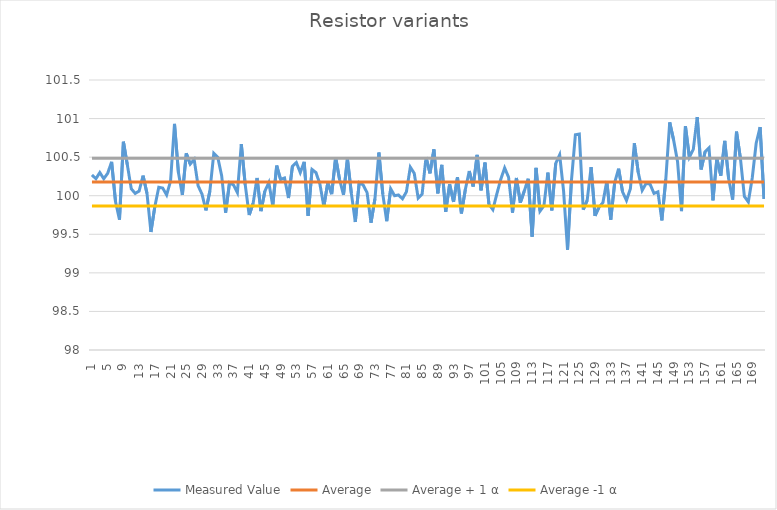
| Category | Measured Value | Average | Average + 1 α | Average -1 α |
|---|---|---|---|---|
| 1.0 | 100.27 | 100.177 | 100.486 | 99.867 |
| 2.0 | 100.22 | 100.177 | 100.486 | 99.867 |
| 3.0 | 100.3 | 100.177 | 100.486 | 99.867 |
| 4.0 | 100.22 | 100.177 | 100.486 | 99.867 |
| 5.0 | 100.29 | 100.177 | 100.486 | 99.867 |
| 6.0 | 100.44 | 100.177 | 100.486 | 99.867 |
| 7.0 | 99.92 | 100.177 | 100.486 | 99.867 |
| 8.0 | 99.69 | 100.177 | 100.486 | 99.867 |
| 9.0 | 100.7 | 100.177 | 100.486 | 99.867 |
| 10.0 | 100.4 | 100.177 | 100.486 | 99.867 |
| 11.0 | 100.09 | 100.177 | 100.486 | 99.867 |
| 12.0 | 100.03 | 100.177 | 100.486 | 99.867 |
| 13.0 | 100.06 | 100.177 | 100.486 | 99.867 |
| 14.0 | 100.26 | 100.177 | 100.486 | 99.867 |
| 15.0 | 100.03 | 100.177 | 100.486 | 99.867 |
| 16.0 | 99.53 | 100.177 | 100.486 | 99.867 |
| 17.0 | 99.86 | 100.177 | 100.486 | 99.867 |
| 18.0 | 100.11 | 100.177 | 100.486 | 99.867 |
| 19.0 | 100.1 | 100.177 | 100.486 | 99.867 |
| 20.0 | 100.01 | 100.177 | 100.486 | 99.867 |
| 21.0 | 100.19 | 100.177 | 100.486 | 99.867 |
| 22.0 | 100.93 | 100.177 | 100.486 | 99.867 |
| 23.0 | 100.3 | 100.177 | 100.486 | 99.867 |
| 24.0 | 100.01 | 100.177 | 100.486 | 99.867 |
| 25.0 | 100.55 | 100.177 | 100.486 | 99.867 |
| 26.0 | 100.41 | 100.177 | 100.486 | 99.867 |
| 27.0 | 100.47 | 100.177 | 100.486 | 99.867 |
| 28.0 | 100.13 | 100.177 | 100.486 | 99.867 |
| 29.0 | 100.02 | 100.177 | 100.486 | 99.867 |
| 30.0 | 99.81 | 100.177 | 100.486 | 99.867 |
| 31.0 | 100.06 | 100.177 | 100.486 | 99.867 |
| 32.0 | 100.55 | 100.177 | 100.486 | 99.867 |
| 33.0 | 100.5 | 100.177 | 100.486 | 99.867 |
| 34.0 | 100.26 | 100.177 | 100.486 | 99.867 |
| 35.0 | 99.78 | 100.177 | 100.486 | 99.867 |
| 36.0 | 100.17 | 100.177 | 100.486 | 99.867 |
| 37.0 | 100.14 | 100.177 | 100.486 | 99.867 |
| 38.0 | 100.04 | 100.177 | 100.486 | 99.867 |
| 39.0 | 100.67 | 100.177 | 100.486 | 99.867 |
| 40.0 | 100.14 | 100.177 | 100.486 | 99.867 |
| 41.0 | 99.75 | 100.177 | 100.486 | 99.867 |
| 42.0 | 99.9 | 100.177 | 100.486 | 99.867 |
| 43.0 | 100.23 | 100.177 | 100.486 | 99.867 |
| 44.0 | 99.8 | 100.177 | 100.486 | 99.867 |
| 45.0 | 100.06 | 100.177 | 100.486 | 99.867 |
| 46.0 | 100.17 | 100.177 | 100.486 | 99.867 |
| 47.0 | 99.87 | 100.177 | 100.486 | 99.867 |
| 48.0 | 100.39 | 100.177 | 100.486 | 99.867 |
| 49.0 | 100.21 | 100.177 | 100.486 | 99.867 |
| 50.0 | 100.23 | 100.177 | 100.486 | 99.867 |
| 51.0 | 99.97 | 100.177 | 100.486 | 99.867 |
| 52.0 | 100.38 | 100.177 | 100.486 | 99.867 |
| 53.0 | 100.43 | 100.177 | 100.486 | 99.867 |
| 54.0 | 100.3 | 100.177 | 100.486 | 99.867 |
| 55.0 | 100.44 | 100.177 | 100.486 | 99.867 |
| 56.0 | 99.74 | 100.177 | 100.486 | 99.867 |
| 57.0 | 100.34 | 100.177 | 100.486 | 99.867 |
| 58.0 | 100.3 | 100.177 | 100.486 | 99.867 |
| 59.0 | 100.15 | 100.177 | 100.486 | 99.867 |
| 60.0 | 99.86 | 100.177 | 100.486 | 99.867 |
| 61.0 | 100.17 | 100.177 | 100.486 | 99.867 |
| 62.0 | 100.02 | 100.177 | 100.486 | 99.867 |
| 63.0 | 100.5 | 100.177 | 100.486 | 99.867 |
| 64.0 | 100.21 | 100.177 | 100.486 | 99.867 |
| 65.0 | 100.01 | 100.177 | 100.486 | 99.867 |
| 66.0 | 100.48 | 100.177 | 100.486 | 99.867 |
| 67.0 | 100.03 | 100.177 | 100.486 | 99.867 |
| 68.0 | 99.66 | 100.177 | 100.486 | 99.867 |
| 69.0 | 100.17 | 100.177 | 100.486 | 99.867 |
| 70.0 | 100.14 | 100.177 | 100.486 | 99.867 |
| 71.0 | 100.04 | 100.177 | 100.486 | 99.867 |
| 72.0 | 99.65 | 100.177 | 100.486 | 99.867 |
| 73.0 | 99.96 | 100.177 | 100.486 | 99.867 |
| 74.0 | 100.56 | 100.177 | 100.486 | 99.867 |
| 75.0 | 100.02 | 100.177 | 100.486 | 99.867 |
| 76.0 | 99.67 | 100.177 | 100.486 | 99.867 |
| 77.0 | 100.09 | 100.177 | 100.486 | 99.867 |
| 78.0 | 100 | 100.177 | 100.486 | 99.867 |
| 79.0 | 100.01 | 100.177 | 100.486 | 99.867 |
| 80.0 | 99.96 | 100.177 | 100.486 | 99.867 |
| 81.0 | 100.05 | 100.177 | 100.486 | 99.867 |
| 82.0 | 100.37 | 100.177 | 100.486 | 99.867 |
| 83.0 | 100.29 | 100.177 | 100.486 | 99.867 |
| 84.0 | 99.97 | 100.177 | 100.486 | 99.867 |
| 85.0 | 100.02 | 100.177 | 100.486 | 99.867 |
| 86.0 | 100.5 | 100.177 | 100.486 | 99.867 |
| 87.0 | 100.29 | 100.177 | 100.486 | 99.867 |
| 88.0 | 100.6 | 100.177 | 100.486 | 99.867 |
| 89.0 | 100.03 | 100.177 | 100.486 | 99.867 |
| 90.0 | 100.4 | 100.177 | 100.486 | 99.867 |
| 91.0 | 99.79 | 100.177 | 100.486 | 99.867 |
| 92.0 | 100.15 | 100.177 | 100.486 | 99.867 |
| 93.0 | 99.92 | 100.177 | 100.486 | 99.867 |
| 94.0 | 100.24 | 100.177 | 100.486 | 99.867 |
| 95.0 | 99.77 | 100.177 | 100.486 | 99.867 |
| 96.0 | 100.08 | 100.177 | 100.486 | 99.867 |
| 97.0 | 100.32 | 100.177 | 100.486 | 99.867 |
| 98.0 | 100.12 | 100.177 | 100.486 | 99.867 |
| 99.0 | 100.53 | 100.177 | 100.486 | 99.867 |
| 100.0 | 100.07 | 100.177 | 100.486 | 99.867 |
| 101.0 | 100.43 | 100.177 | 100.486 | 99.867 |
| 102.0 | 99.89 | 100.177 | 100.486 | 99.867 |
| 103.0 | 99.82 | 100.177 | 100.486 | 99.867 |
| 104.0 | 100.02 | 100.177 | 100.486 | 99.867 |
| 105.0 | 100.21 | 100.177 | 100.486 | 99.867 |
| 106.0 | 100.36 | 100.177 | 100.486 | 99.867 |
| 107.0 | 100.24 | 100.177 | 100.486 | 99.867 |
| 108.0 | 99.78 | 100.177 | 100.486 | 99.867 |
| 109.0 | 100.23 | 100.177 | 100.486 | 99.867 |
| 110.0 | 99.91 | 100.177 | 100.486 | 99.867 |
| 111.0 | 100.06 | 100.177 | 100.486 | 99.867 |
| 112.0 | 100.22 | 100.177 | 100.486 | 99.867 |
| 113.0 | 99.47 | 100.177 | 100.486 | 99.867 |
| 114.0 | 100.36 | 100.177 | 100.486 | 99.867 |
| 115.0 | 99.8 | 100.177 | 100.486 | 99.867 |
| 116.0 | 99.87 | 100.177 | 100.486 | 99.867 |
| 117.0 | 100.3 | 100.177 | 100.486 | 99.867 |
| 118.0 | 99.81 | 100.177 | 100.486 | 99.867 |
| 119.0 | 100.42 | 100.177 | 100.486 | 99.867 |
| 120.0 | 100.53 | 100.177 | 100.486 | 99.867 |
| 121.0 | 100.06 | 100.177 | 100.486 | 99.867 |
| 122.0 | 99.3 | 100.177 | 100.486 | 99.867 |
| 123.0 | 100.2 | 100.177 | 100.486 | 99.867 |
| 124.0 | 100.79 | 100.177 | 100.486 | 99.867 |
| 125.0 | 100.8 | 100.177 | 100.486 | 99.867 |
| 126.0 | 99.82 | 100.177 | 100.486 | 99.867 |
| 127.0 | 99.94 | 100.177 | 100.486 | 99.867 |
| 128.0 | 100.37 | 100.177 | 100.486 | 99.867 |
| 129.0 | 99.74 | 100.177 | 100.486 | 99.867 |
| 130.0 | 99.85 | 100.177 | 100.486 | 99.867 |
| 131.0 | 99.91 | 100.177 | 100.486 | 99.867 |
| 132.0 | 100.19 | 100.177 | 100.486 | 99.867 |
| 133.0 | 99.69 | 100.177 | 100.486 | 99.867 |
| 134.0 | 100.17 | 100.177 | 100.486 | 99.867 |
| 135.0 | 100.35 | 100.177 | 100.486 | 99.867 |
| 136.0 | 100.05 | 100.177 | 100.486 | 99.867 |
| 137.0 | 99.94 | 100.177 | 100.486 | 99.867 |
| 138.0 | 100.09 | 100.177 | 100.486 | 99.867 |
| 139.0 | 100.68 | 100.177 | 100.486 | 99.867 |
| 140.0 | 100.3 | 100.177 | 100.486 | 99.867 |
| 141.0 | 100.07 | 100.177 | 100.486 | 99.867 |
| 142.0 | 100.16 | 100.177 | 100.486 | 99.867 |
| 143.0 | 100.15 | 100.177 | 100.486 | 99.867 |
| 144.0 | 100.03 | 100.177 | 100.486 | 99.867 |
| 145.0 | 100.05 | 100.177 | 100.486 | 99.867 |
| 146.0 | 99.68 | 100.177 | 100.486 | 99.867 |
| 147.0 | 100.21 | 100.177 | 100.486 | 99.867 |
| 148.0 | 100.95 | 100.177 | 100.486 | 99.867 |
| 149.0 | 100.72 | 100.177 | 100.486 | 99.867 |
| 150.0 | 100.44 | 100.177 | 100.486 | 99.867 |
| 151.0 | 99.8 | 100.177 | 100.486 | 99.867 |
| 152.0 | 100.9 | 100.177 | 100.486 | 99.867 |
| 153.0 | 100.5 | 100.177 | 100.486 | 99.867 |
| 154.0 | 100.6 | 100.177 | 100.486 | 99.867 |
| 155.0 | 101.02 | 100.177 | 100.486 | 99.867 |
| 156.0 | 100.34 | 100.177 | 100.486 | 99.867 |
| 157.0 | 100.57 | 100.177 | 100.486 | 99.867 |
| 158.0 | 100.62 | 100.177 | 100.486 | 99.867 |
| 159.0 | 99.94 | 100.177 | 100.486 | 99.867 |
| 160.0 | 100.48 | 100.177 | 100.486 | 99.867 |
| 161.0 | 100.26 | 100.177 | 100.486 | 99.867 |
| 162.0 | 100.71 | 100.177 | 100.486 | 99.867 |
| 163.0 | 100.22 | 100.177 | 100.486 | 99.867 |
| 164.0 | 99.95 | 100.177 | 100.486 | 99.867 |
| 165.0 | 100.83 | 100.177 | 100.486 | 99.867 |
| 166.0 | 100.48 | 100.177 | 100.486 | 99.867 |
| 167.0 | 99.99 | 100.177 | 100.486 | 99.867 |
| 168.0 | 99.92 | 100.177 | 100.486 | 99.867 |
| 169.0 | 100.23 | 100.177 | 100.486 | 99.867 |
| 170.0 | 100.68 | 100.177 | 100.486 | 99.867 |
| 171.0 | 100.89 | 100.177 | 100.486 | 99.867 |
| 172.0 | 99.96 | 100.177 | 100.486 | 99.867 |